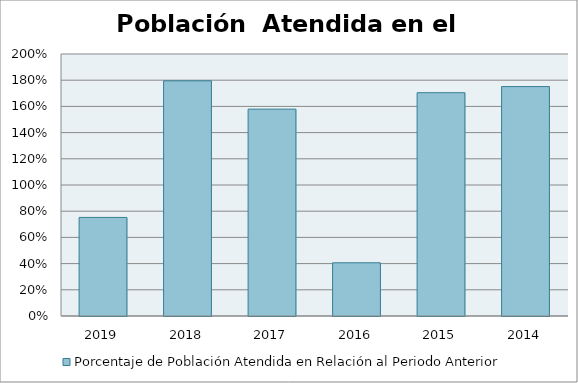
| Category | Porcentaje de Población Atendida en Relación al Periodo Anterior |
|---|---|
| 2019.0 | 0.752 |
| 2018.0 | 1.795 |
| 2017.0 | 1.579 |
| 2016.0 | 0.406 |
| 2015.0 | 1.704 |
| 2014.0 | 1.751 |